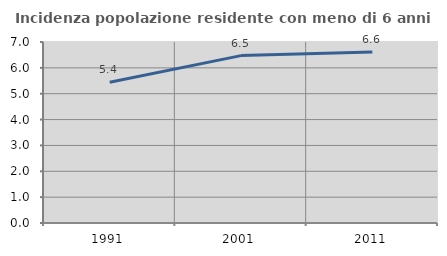
| Category | Incidenza popolazione residente con meno di 6 anni |
|---|---|
| 1991.0 | 5.44 |
| 2001.0 | 6.474 |
| 2011.0 | 6.609 |